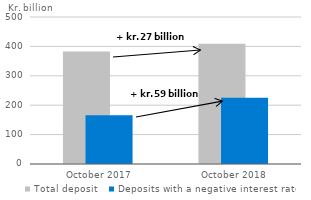
| Category | Total deposit | Deposits with a negative interest rate |
|---|---|---|
| October 2017 | 382.521 | 166.207 |
| October 2018 | 409.053 | 225.599 |